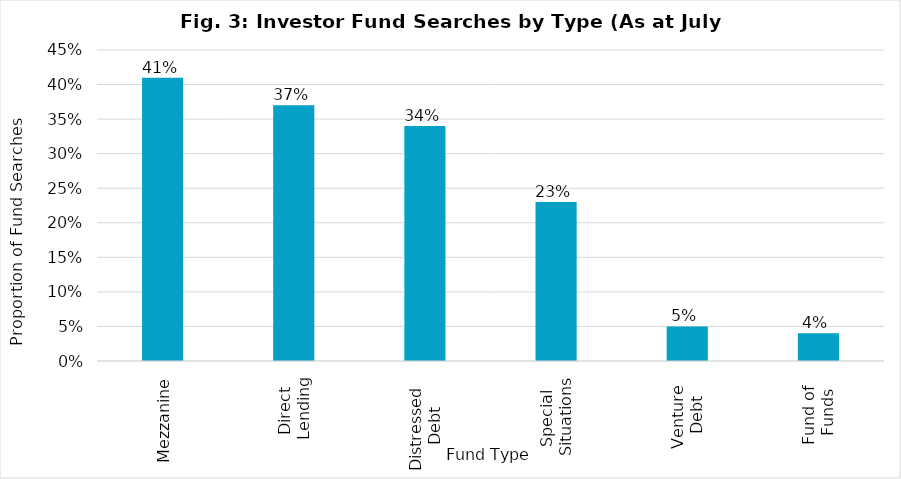
| Category | Proportion of Fund Searches |
|---|---|
| Mezzanine | 0.41 |
| Direct 
Lending | 0.37 |
| Distressed 
Debt | 0.34 |
| Special 
Situations | 0.23 |
| Venture 
Debt | 0.05 |
| Fund of 
Funds | 0.04 |